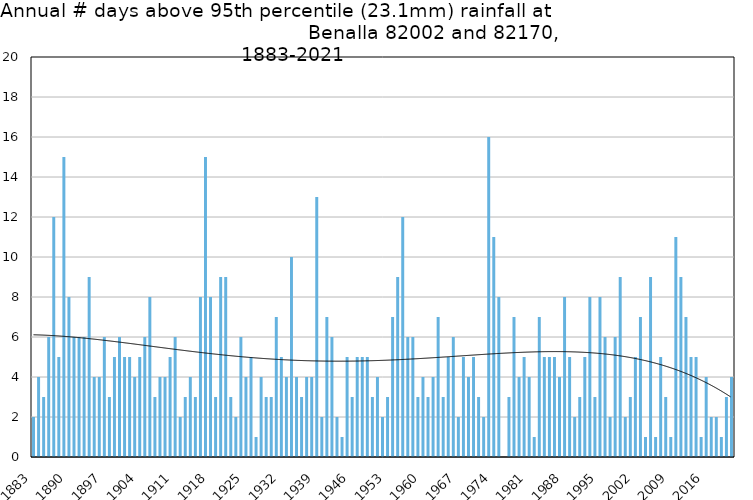
| Category | Annual # days above 95th percentile |
|---|---|
| 1883 | 2 |
| 1884 | 4 |
| 1885 | 3 |
| 1886 | 6 |
| 1887 | 12 |
| 1888 | 5 |
| 1889 | 15 |
| 1890 | 8 |
| 1891 | 6 |
| 1892 | 6 |
| 1893 | 6 |
| 1894 | 9 |
| 1895 | 4 |
| 1896 | 4 |
| 1897 | 6 |
| 1898 | 3 |
| 1899 | 5 |
| 1900 | 6 |
| 1901 | 5 |
| 1902 | 5 |
| 1903 | 4 |
| 1904 | 5 |
| 1905 | 6 |
| 1906 | 8 |
| 1907 | 3 |
| 1908 | 4 |
| 1909 | 4 |
| 1910 | 5 |
| 1911 | 6 |
| 1912 | 2 |
| 1913 | 3 |
| 1914 | 4 |
| 1915 | 3 |
| 1916 | 8 |
| 1917 | 15 |
| 1918 | 8 |
| 1919 | 3 |
| 1920 | 9 |
| 1921 | 9 |
| 1922 | 3 |
| 1923 | 2 |
| 1924 | 6 |
| 1925 | 4 |
| 1926 | 5 |
| 1927 | 1 |
| 1928 | 4 |
| 1929 | 3 |
| 1930 | 3 |
| 1931 | 7 |
| 1932 | 5 |
| 1933 | 4 |
| 1934 | 10 |
| 1935 | 4 |
| 1936 | 3 |
| 1937 | 4 |
| 1938 | 4 |
| 1939 | 13 |
| 1940 | 2 |
| 1941 | 7 |
| 1942 | 6 |
| 1943 | 2 |
| 1944 | 1 |
| 1945 | 5 |
| 1946 | 3 |
| 1947 | 5 |
| 1948 | 5 |
| 1949 | 5 |
| 1950 | 3 |
| 1951 | 4 |
| 1952 | 2 |
| 1953 | 3 |
| 1954 | 7 |
| 1955 | 9 |
| 1956 | 12 |
| 1957 | 6 |
| 1958 | 6 |
| 1959 | 3 |
| 1960 | 4 |
| 1961 | 3 |
| 1962 | 4 |
| 1963 | 7 |
| 1964 | 3 |
| 1965 | 5 |
| 1966 | 6 |
| 1967 | 2 |
| 1968 | 5 |
| 1969 | 4 |
| 1970 | 5 |
| 1971 | 3 |
| 1972 | 2 |
| 1973 | 16 |
| 1974 | 11 |
| 1975 | 8 |
| 1976 | 0 |
| 1977 | 3 |
| 1978 | 7 |
| 1979 | 4 |
| 1980 | 5 |
| 1981 | 4 |
| 1982 | 1 |
| 1983 | 7 |
| 1984 | 5 |
| 1985 | 5 |
| 1986 | 5 |
| 1987 | 4 |
| 1988 | 8 |
| 1989 | 5 |
| 1990 | 2 |
| 1991 | 3 |
| 1992 | 5 |
| 1993 | 8 |
| 1994 | 3 |
| 1995 | 8 |
| 1996 | 6 |
| 1997 | 2 |
| 1998 | 6 |
| 1999 | 9 |
| 2000 | 2 |
| 2001 | 3 |
| 2002 | 5 |
| 2003 | 7 |
| 2004 | 1 |
| 2005 | 9 |
| 2006 | 1 |
| 2007 | 5 |
| 2008 | 3 |
| 2009 | 1 |
| 2010 | 11 |
| 2011 | 9 |
| 2012 | 7 |
| 2013 | 5 |
| 2014 | 5 |
| 2015 | 1 |
| 2016 | 4 |
| 2017 | 2 |
| 2018 | 2 |
| 2019 | 1 |
| 2020 | 3 |
| 2021 | 4 |